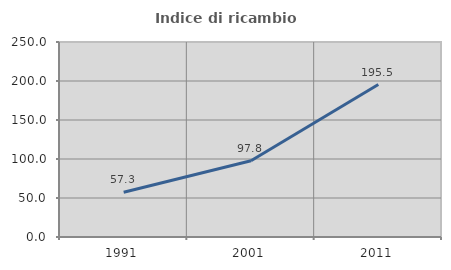
| Category | Indice di ricambio occupazionale  |
|---|---|
| 1991.0 | 57.346 |
| 2001.0 | 97.846 |
| 2011.0 | 195.472 |